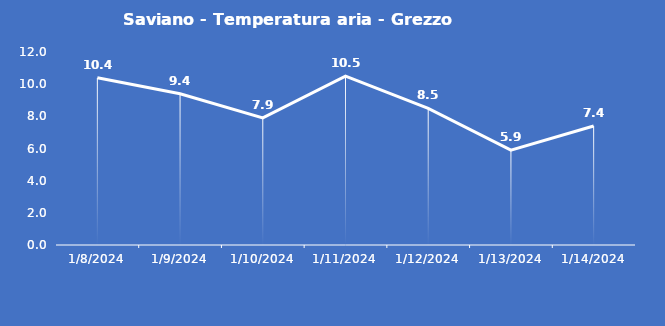
| Category | Saviano - Temperatura aria - Grezzo (°C) |
|---|---|
| 1/8/24 | 10.4 |
| 1/9/24 | 9.4 |
| 1/10/24 | 7.9 |
| 1/11/24 | 10.5 |
| 1/12/24 | 8.5 |
| 1/13/24 | 5.9 |
| 1/14/24 | 7.4 |